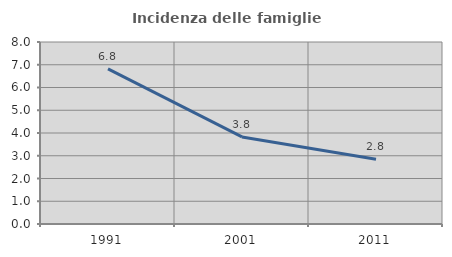
| Category | Incidenza delle famiglie numerose |
|---|---|
| 1991.0 | 6.822 |
| 2001.0 | 3.826 |
| 2011.0 | 2.842 |